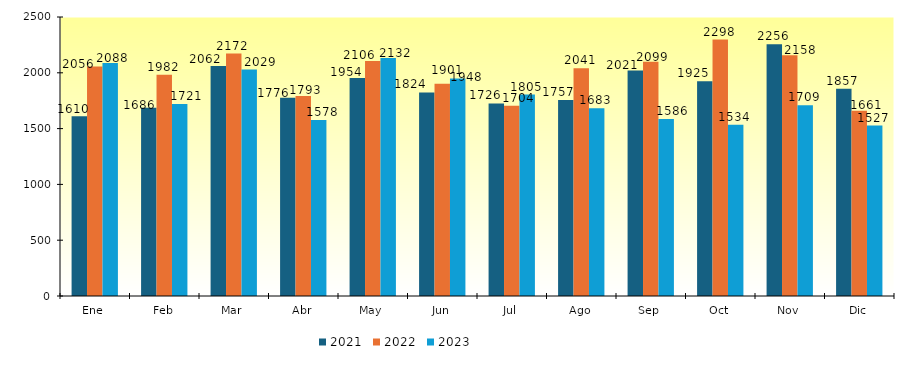
| Category | 2021 | 2022 | 2023 |
|---|---|---|---|
| Ene | 1610 | 2056 | 2088 |
| Feb | 1686 | 1982 | 1721 |
| Mar | 2062 | 2172 | 2029 |
| Abr | 1776 | 1793 | 1578 |
| May | 1954 | 2106 | 2132 |
| Jun | 1824 | 1901 | 1948 |
| Jul | 1726 | 1704 | 1805 |
| Ago | 1757 | 2041 | 1683 |
| Sep | 2021 | 2099 | 1586 |
| Oct | 1925 | 2298 | 1534 |
| Nov | 2256 | 2158 | 1709 |
| Dic | 1857 | 1661 | 1527 |